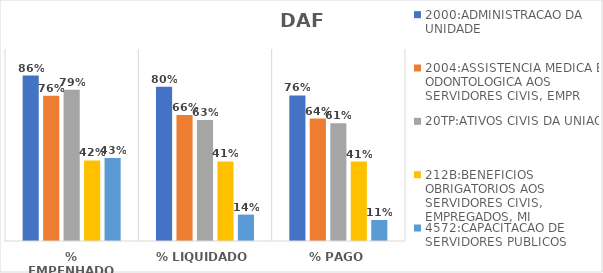
| Category | 2000:ADMINISTRACAO DA UNIDADE | 2004:ASSISTENCIA MEDICA E ODONTOLOGICA AOS SERVIDORES CIVIS, EMPR | 20TP:ATIVOS CIVIS DA UNIAO | 212B:BENEFICIOS OBRIGATORIOS AOS SERVIDORES CIVIS, EMPREGADOS, MI | 4572:CAPACITACAO DE SERVIDORES PUBLICOS FEDERAIS EM PROCESSO DE Q |
|---|---|---|---|---|---|
| % EMPENHADO | 0.862 | 0.757 | 0.788 | 0.42 | 0.432 |
| % LIQUIDADO | 0.803 | 0.657 | 0.63 | 0.415 | 0.138 |
| % PAGO | 0.758 | 0.638 | 0.613 | 0.414 | 0.109 |